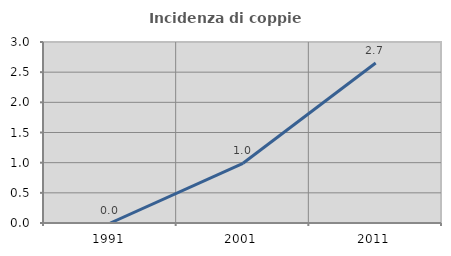
| Category | Incidenza di coppie miste |
|---|---|
| 1991.0 | 0 |
| 2001.0 | 0.99 |
| 2011.0 | 2.652 |